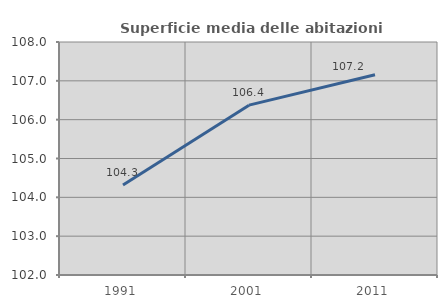
| Category | Superficie media delle abitazioni occupate |
|---|---|
| 1991.0 | 104.318 |
| 2001.0 | 106.373 |
| 2011.0 | 107.155 |